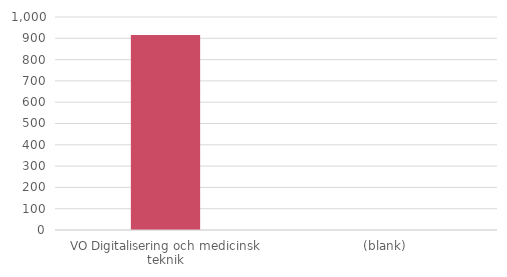
| Category | Summa |
|---|---|
| VO Digitalisering och medicinsk teknik | 916 |
| (blank) | 0 |